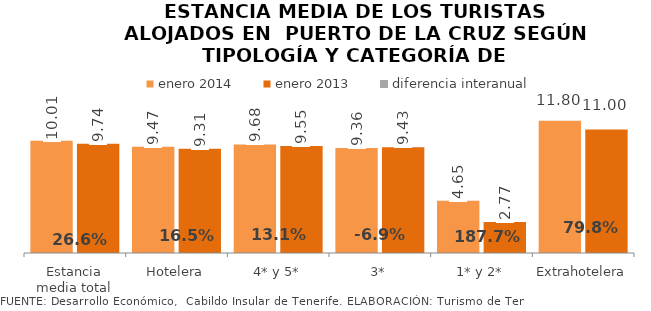
| Category | enero 2014 | enero 2013 |
|---|---|---|
| Estancia media total | 10.01 | 9.744 |
| Hotelera | 9.47 | 9.305 |
| 4* y 5* | 9.682 | 9.551 |
| 3* | 9.36 | 9.429 |
| 1* y 2* | 4.649 | 2.772 |
| Extrahotelera | 11.8 | 11.002 |